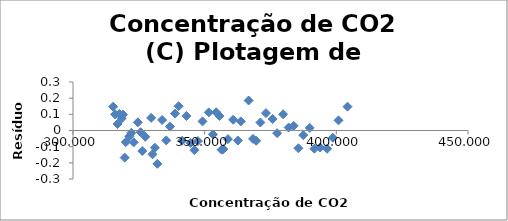
| Category | Series 0 |
|---|---|
| 315.241 | 0.147 |
| 315.9741666666667 | 0.1 |
| 316.90749999999997 | 0.04 |
| 317.63750000000005 | 0.103 |
| 318.4508333333333 | 0.074 |
| 318.9941666666667 | 0.099 |
| 319.61749999999995 | -0.168 |
| 320.0441666666667 | -0.072 |
| 321.38333333333327 | -0.036 |
| 322.1575 | -0.014 |
| 323.04499999999996 | -0.073 |
| 324.62416666666667 | 0.05 |
| 325.68 | -0.01 |
| 326.32 | -0.127 |
| 327.4533333333333 | -0.039 |
| 329.6766666666667 | 0.078 |
| 330.18416666666667 | -0.147 |
| 331.115 | -0.107 |
| 332.03999999999996 | -0.206 |
| 333.83166666666665 | 0.065 |
| 335.40416666666664 | -0.061 |
| 336.84166666666664 | 0.024 |
| 338.75166666666667 | 0.104 |
| 340.10499999999996 | 0.15 |
| 341.4475 | -0.063 |
| 343.0541666666666 | 0.09 |
| 344.65083333333337 | -0.077 |
| 346.11583333333334 | -0.122 |
| 347.4199999999999 | -0.065 |
| 349.19416666666666 | 0.056 |
| 351.56666666666666 | 0.112 |
| 353.1208333333334 | -0.024 |
| 354.3941666666667 | 0.113 |
| 355.6075 | 0.09 |
| 356.4458333333334 | -0.118 |
| 357.09999999999997 | -0.115 |
| 358.8333333333333 | -0.053 |
| 360.82 | 0.066 |
| 362.6066666666666 | -0.062 |
| 363.7291666666667 | 0.056 |
| 366.6991666666667 | 0.186 |
| 368.37750000000005 | -0.052 |
| 369.5491666666667 | -0.064 |
| 371.1433333333334 | 0.05 |
| 373.27916666666664 | 0.107 |
| 375.8025 | 0.071 |
| 377.52250000000004 | -0.016 |
| 379.7958333333333 | 0.1 |
| 381.89583333333326 | 0.018 |
| 383.7916666666666 | 0.029 |
| 385.6041666666667 | -0.11 |
| 387.43 | -0.029 |
| 389.89916666666664 | 0.016 |
| 391.6525 | -0.112 |
| 393.8533333333334 | -0.105 |
| 396.5208333333333 | -0.113 |
| 398.6475 | -0.045 |
| 400.8341666666667 | 0.063 |
| 404.2391666666667 | 0.147 |